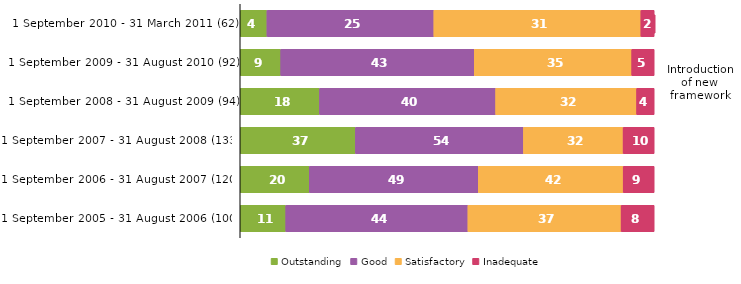
| Category | Outstanding | Good | Satisfactory | Inadequate |
|---|---|---|---|---|
| 1 September 2010 - 31 March 2011 (62) | 4 | 25 | 31 | 2 |
| 1 September 2009 - 31 August 2010 (92) | 9 | 43 | 35 | 5 |
| 1 September 2008 - 31 August 2009 (94) | 18 | 40 | 32 | 4 |
| 1 September 2007 - 31 August 2008 (133) | 37 | 54 | 32 | 10 |
| 1 September 2006 - 31 August 2007 (120) | 20 | 49 | 42 | 9 |
| 1 September 2005 - 31 August 2006 (100) | 11 | 44 | 37 | 8 |